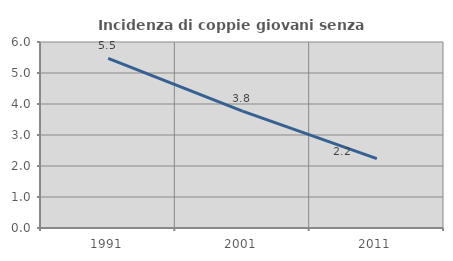
| Category | Incidenza di coppie giovani senza figli |
|---|---|
| 1991.0 | 5.473 |
| 2001.0 | 3.769 |
| 2011.0 | 2.24 |